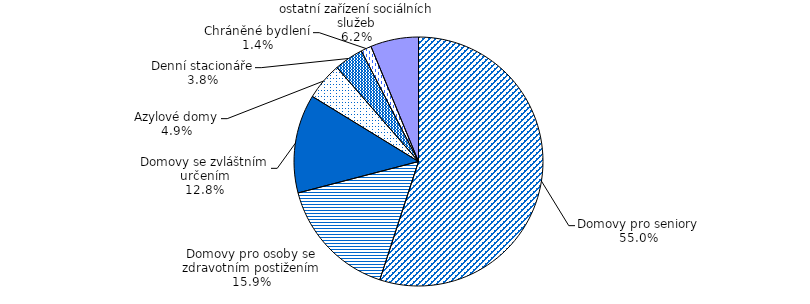
| Category | Series 0 |
|---|---|
| Domovy pro seniory | 2181 |
| Domovy pro osoby se zdravotním postižením | 630 |
| Domovy se zvláštním určením | 508 |
| Azylové domy | 193 |
| Denní stacionáře | 150 |
| Chráněné bydlení | 54 |
| ostatní zařízení sociálních služeb | 247 |